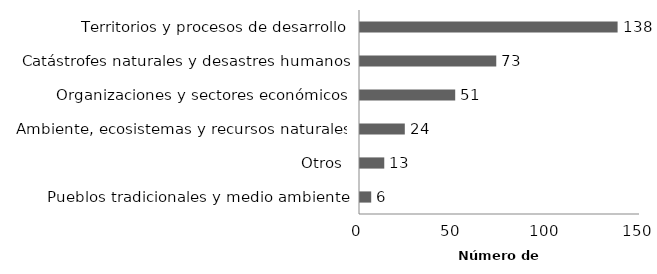
| Category | Series 0 |
|---|---|
| Pueblos tradicionales y medio ambiente | 6 |
| Otros | 13 |
|  Ambiente, ecosistemas y recursos naturales | 24 |
| Organizaciones y sectores económicos | 51 |
| Catástrofes naturales y desastres humanos | 73 |
| Territorios y procesos de desarrollo | 138 |